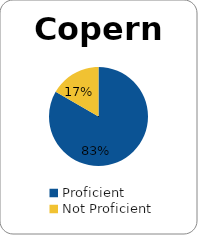
| Category | Series 0 |
|---|---|
| Proficient | 0.833 |
| Not Proficient | 0.167 |